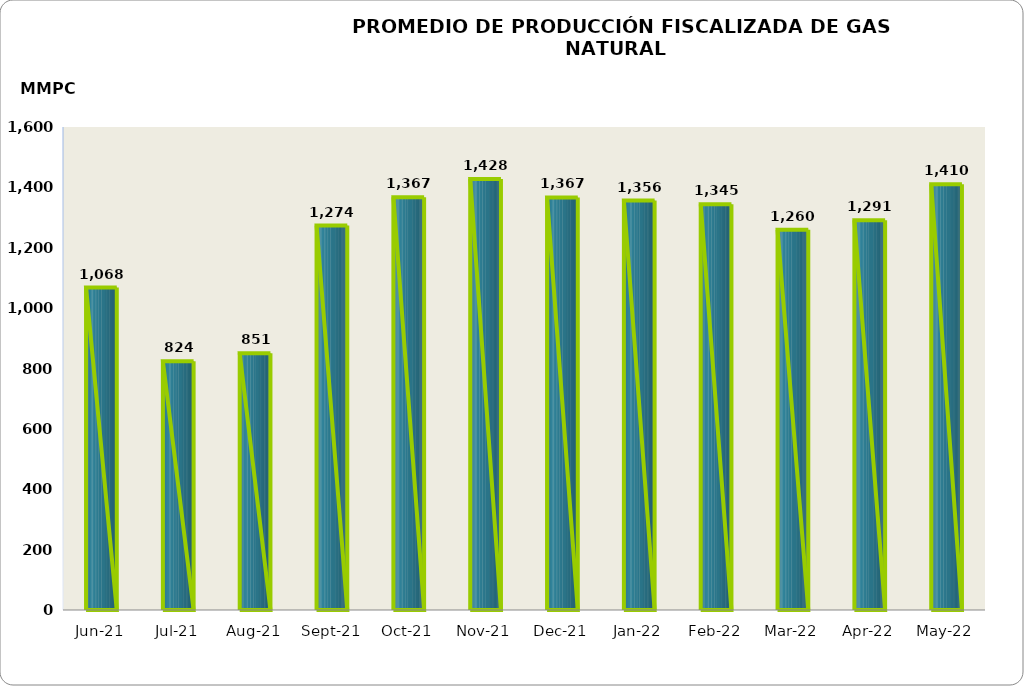
| Category | Series 0 |
|---|---|
| 2021-06-01 | 1068128.403 |
| 2021-07-01 | 823834.105 |
| 2021-08-01 | 850929.254 |
| 2021-09-01 | 1273570.561 |
| 2021-10-01 | 1367318.609 |
| 2021-11-01 | 1428097.616 |
| 2021-12-01 | 1366833.527 |
| 2022-01-01 | 1356402.082 |
| 2022-02-01 | 1344504.622 |
| 2022-03-01 | 1259914.198 |
| 2022-04-01 | 1291170.944 |
| 2022-05-01 | 1410361.644 |